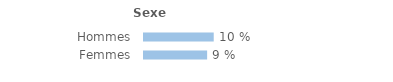
| Category | Series 0 |
|---|---|
| Hommes | 0.105 |
| Femmes | 0.095 |